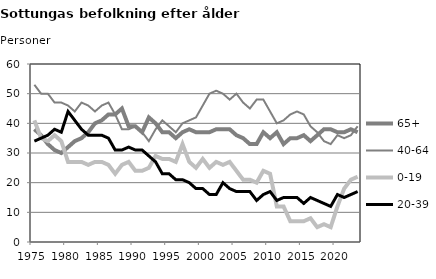
| Category | 65+ | 40-64 | 0-19 | 20-39 |
|---|---|---|---|---|
| 1975.0 | 38 | 53 | 41 | 34 |
| 1976.0 | 36 | 50 | 35 | 35 |
| 1977.0 | 33 | 50 | 34 | 36 |
| 1978.0 | 31 | 47 | 36 | 38 |
| 1979.0 | 30 | 47 | 34 | 37 |
| 1980.0 | 32 | 46 | 27 | 44 |
| 1981.0 | 34 | 44 | 27 | 41 |
| 1982.0 | 35 | 47 | 27 | 38 |
| 1983.0 | 37 | 46 | 26 | 36 |
| 1984.0 | 40 | 44 | 27 | 36 |
| 1985.0 | 41 | 46 | 27 | 36 |
| 1986.0 | 43 | 47 | 26 | 35 |
| 1987.0 | 43 | 43 | 23 | 31 |
| 1988.0 | 45 | 38 | 26 | 31 |
| 1989.0 | 39 | 38 | 27 | 32 |
| 1990.0 | 39 | 39 | 24 | 31 |
| 1991.0 | 37 | 37 | 24 | 31 |
| 1992.0 | 42 | 34 | 25 | 29 |
| 1993.0 | 40 | 38 | 29 | 27 |
| 1994.0 | 37 | 41 | 28 | 23 |
| 1995.0 | 37 | 39 | 28 | 23 |
| 1996.0 | 35 | 37 | 27 | 21 |
| 1997.0 | 37 | 40 | 33 | 21 |
| 1998.0 | 38 | 41 | 27 | 20 |
| 1999.0 | 37 | 42 | 25 | 18 |
| 2000.0 | 37 | 46 | 28 | 18 |
| 2001.0 | 37 | 50 | 25 | 16 |
| 2002.0 | 38 | 51 | 27 | 16 |
| 2003.0 | 38 | 50 | 26 | 20 |
| 2004.0 | 38 | 48 | 27 | 18 |
| 2005.0 | 36 | 50 | 24 | 17 |
| 2006.0 | 35 | 47 | 21 | 17 |
| 2007.0 | 33 | 45 | 21 | 17 |
| 2008.0 | 33 | 48 | 20 | 14 |
| 2009.0 | 37 | 48 | 24 | 16 |
| 2010.0 | 35 | 44 | 23 | 17 |
| 2011.0 | 37 | 40 | 12 | 14 |
| 2012.0 | 33 | 41 | 12 | 15 |
| 2013.0 | 35 | 43 | 7 | 15 |
| 2014.0 | 35 | 44 | 7 | 15 |
| 2015.0 | 36 | 43 | 7 | 13 |
| 2016.0 | 34 | 39 | 8 | 15 |
| 2017.0 | 36 | 37 | 5 | 14 |
| 2018.0 | 38 | 34 | 6 | 13 |
| 2019.0 | 38 | 33 | 5 | 12 |
| 2020.0 | 37 | 36 | 12 | 16 |
| 2021.0 | 37 | 35 | 18 | 15 |
| 2022.0 | 38 | 36 | 21 | 16 |
| 2023.0 | 37 | 39 | 22 | 17 |